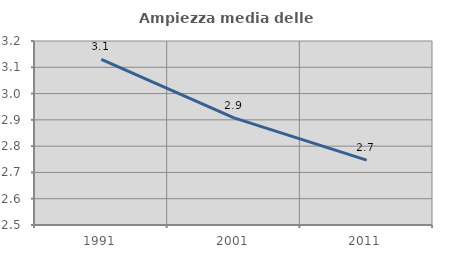
| Category | Ampiezza media delle famiglie |
|---|---|
| 1991.0 | 3.13 |
| 2001.0 | 2.908 |
| 2011.0 | 2.747 |